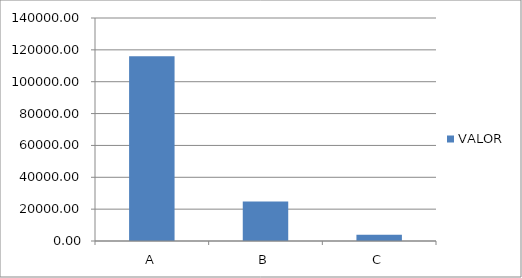
| Category | VALOR |
|---|---|
| A | 116000 |
| B | 24750 |
| C | 3980 |